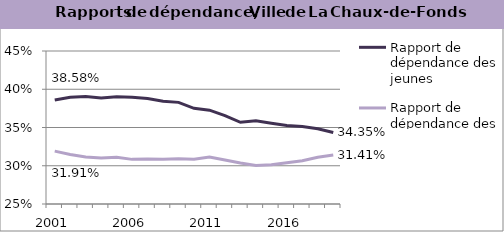
| Category | Rapport de dépendance des jeunes | Rapport de dépendance des personnes âgées |
|---|---|---|
| 2001.0 | 0.386 | 0.319 |
| 2002.0 | 0.39 | 0.315 |
| 2003.0 | 0.39 | 0.311 |
| 2004.0 | 0.389 | 0.31 |
| 2005.0 | 0.39 | 0.311 |
| 2006.0 | 0.39 | 0.308 |
| 2007.0 | 0.388 | 0.309 |
| 2008.0 | 0.384 | 0.308 |
| 2009.0 | 0.383 | 0.309 |
| 2010.0 | 0.375 | 0.308 |
| 2011.0 | 0.373 | 0.311 |
| 2012.0 | 0.366 | 0.308 |
| 2013.0 | 0.357 | 0.304 |
| 2014.0 | 0.359 | 0.3 |
| 2015.0 | 0.355 | 0.301 |
| 2016.0 | 0.353 | 0.304 |
| 2017.0 | 0.351 | 0.307 |
| 2018.0 | 0.348 | 0.311 |
| 2019.0 | 0.344 | 0.314 |